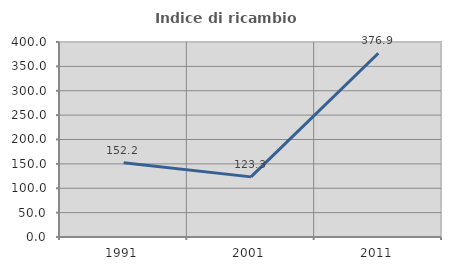
| Category | Indice di ricambio occupazionale  |
|---|---|
| 1991.0 | 152.174 |
| 2001.0 | 123.333 |
| 2011.0 | 376.923 |